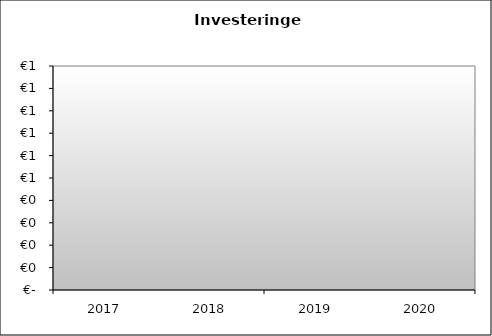
| Category | Series 0 |
|---|---|
| 2017.0 | 0 |
| 2018.0 | 0 |
| 2019.0 | 0 |
| 2020.0 | 0 |